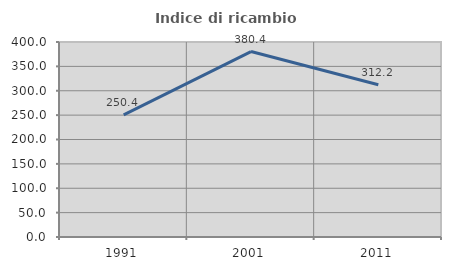
| Category | Indice di ricambio occupazionale  |
|---|---|
| 1991.0 | 250.407 |
| 2001.0 | 380.383 |
| 2011.0 | 312.203 |